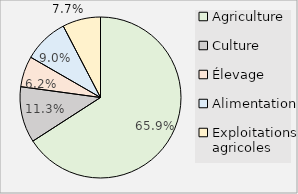
| Category | Percent |
|---|---|
| Agriculture | 0.659 |
| Culture | 0.113 |
| Élevage | 0.062 |
| Alimentation | 0.09 |
| Exploitations agricoles | 0.077 |